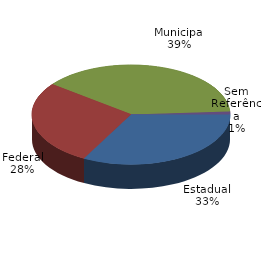
| Category | Qtde Acidentes |
|---|---|
| Estadual | 499 |
| Federal | 418 |
| Municipal | 587 |
| Sem Referência | 15 |